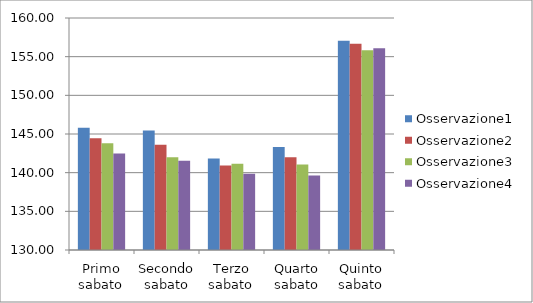
| Category | Osservazione1 | Osservazione2 | Osservazione3 | Osservazione4 |
|---|---|---|---|---|
| Primo sabato | 145.822 | 144.444 | 143.802 | 142.479 |
| Secondo sabato | 145.455 | 143.614 | 141.984 | 141.553 |
| Terzo sabato | 141.826 | 140.921 | 141.144 | 139.865 |
| Quarto sabato | 143.316 | 141.979 | 141.043 | 139.628 |
| Quinto sabato | 157.046 | 156.676 | 155.827 | 156.098 |